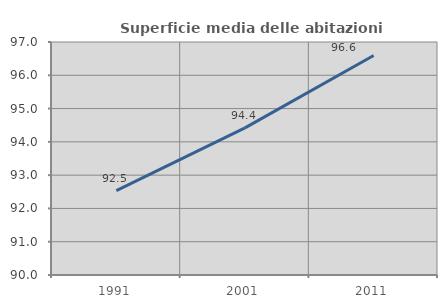
| Category | Superficie media delle abitazioni occupate |
|---|---|
| 1991.0 | 92.535 |
| 2001.0 | 94.42 |
| 2011.0 | 96.594 |